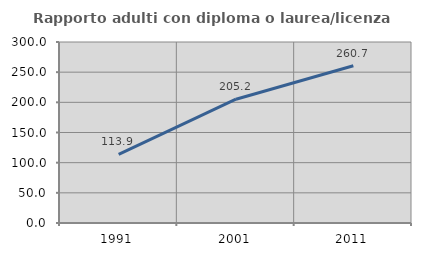
| Category | Rapporto adulti con diploma o laurea/licenza media  |
|---|---|
| 1991.0 | 113.907 |
| 2001.0 | 205.195 |
| 2011.0 | 260.656 |